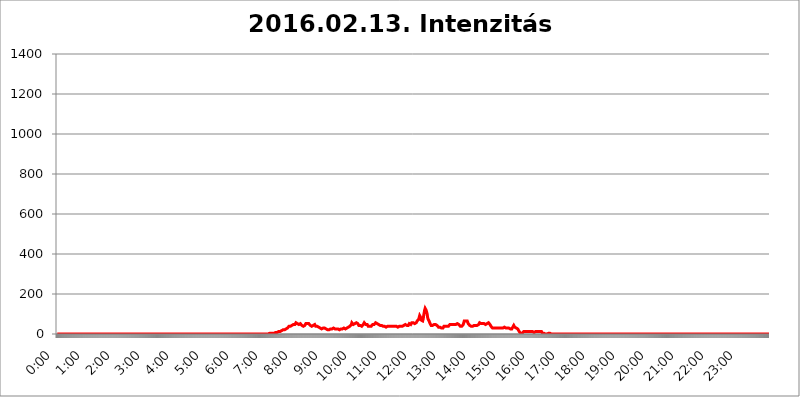
| Category | 2016.02.13. Intenzitás [W/m^2] |
|---|---|
| 0.0 | 0 |
| 0.0006944444444444445 | 0 |
| 0.001388888888888889 | 0 |
| 0.0020833333333333333 | 0 |
| 0.002777777777777778 | 0 |
| 0.003472222222222222 | 0 |
| 0.004166666666666667 | 0 |
| 0.004861111111111111 | 0 |
| 0.005555555555555556 | 0 |
| 0.0062499999999999995 | 0 |
| 0.006944444444444444 | 0 |
| 0.007638888888888889 | 0 |
| 0.008333333333333333 | 0 |
| 0.009027777777777779 | 0 |
| 0.009722222222222222 | 0 |
| 0.010416666666666666 | 0 |
| 0.011111111111111112 | 0 |
| 0.011805555555555555 | 0 |
| 0.012499999999999999 | 0 |
| 0.013194444444444444 | 0 |
| 0.013888888888888888 | 0 |
| 0.014583333333333332 | 0 |
| 0.015277777777777777 | 0 |
| 0.015972222222222224 | 0 |
| 0.016666666666666666 | 0 |
| 0.017361111111111112 | 0 |
| 0.018055555555555557 | 0 |
| 0.01875 | 0 |
| 0.019444444444444445 | 0 |
| 0.02013888888888889 | 0 |
| 0.020833333333333332 | 0 |
| 0.02152777777777778 | 0 |
| 0.022222222222222223 | 0 |
| 0.02291666666666667 | 0 |
| 0.02361111111111111 | 0 |
| 0.024305555555555556 | 0 |
| 0.024999999999999998 | 0 |
| 0.025694444444444447 | 0 |
| 0.02638888888888889 | 0 |
| 0.027083333333333334 | 0 |
| 0.027777777777777776 | 0 |
| 0.02847222222222222 | 0 |
| 0.029166666666666664 | 0 |
| 0.029861111111111113 | 0 |
| 0.030555555555555555 | 0 |
| 0.03125 | 0 |
| 0.03194444444444445 | 0 |
| 0.03263888888888889 | 0 |
| 0.03333333333333333 | 0 |
| 0.034027777777777775 | 0 |
| 0.034722222222222224 | 0 |
| 0.035416666666666666 | 0 |
| 0.036111111111111115 | 0 |
| 0.03680555555555556 | 0 |
| 0.0375 | 0 |
| 0.03819444444444444 | 0 |
| 0.03888888888888889 | 0 |
| 0.03958333333333333 | 0 |
| 0.04027777777777778 | 0 |
| 0.04097222222222222 | 0 |
| 0.041666666666666664 | 0 |
| 0.042361111111111106 | 0 |
| 0.04305555555555556 | 0 |
| 0.043750000000000004 | 0 |
| 0.044444444444444446 | 0 |
| 0.04513888888888889 | 0 |
| 0.04583333333333334 | 0 |
| 0.04652777777777778 | 0 |
| 0.04722222222222222 | 0 |
| 0.04791666666666666 | 0 |
| 0.04861111111111111 | 0 |
| 0.049305555555555554 | 0 |
| 0.049999999999999996 | 0 |
| 0.05069444444444445 | 0 |
| 0.051388888888888894 | 0 |
| 0.052083333333333336 | 0 |
| 0.05277777777777778 | 0 |
| 0.05347222222222222 | 0 |
| 0.05416666666666667 | 0 |
| 0.05486111111111111 | 0 |
| 0.05555555555555555 | 0 |
| 0.05625 | 0 |
| 0.05694444444444444 | 0 |
| 0.057638888888888885 | 0 |
| 0.05833333333333333 | 0 |
| 0.05902777777777778 | 0 |
| 0.059722222222222225 | 0 |
| 0.06041666666666667 | 0 |
| 0.061111111111111116 | 0 |
| 0.06180555555555556 | 0 |
| 0.0625 | 0 |
| 0.06319444444444444 | 0 |
| 0.06388888888888888 | 0 |
| 0.06458333333333334 | 0 |
| 0.06527777777777778 | 0 |
| 0.06597222222222222 | 0 |
| 0.06666666666666667 | 0 |
| 0.06736111111111111 | 0 |
| 0.06805555555555555 | 0 |
| 0.06874999999999999 | 0 |
| 0.06944444444444443 | 0 |
| 0.07013888888888889 | 0 |
| 0.07083333333333333 | 0 |
| 0.07152777777777779 | 0 |
| 0.07222222222222223 | 0 |
| 0.07291666666666667 | 0 |
| 0.07361111111111111 | 0 |
| 0.07430555555555556 | 0 |
| 0.075 | 0 |
| 0.07569444444444444 | 0 |
| 0.0763888888888889 | 0 |
| 0.07708333333333334 | 0 |
| 0.07777777777777778 | 0 |
| 0.07847222222222222 | 0 |
| 0.07916666666666666 | 0 |
| 0.0798611111111111 | 0 |
| 0.08055555555555556 | 0 |
| 0.08125 | 0 |
| 0.08194444444444444 | 0 |
| 0.08263888888888889 | 0 |
| 0.08333333333333333 | 0 |
| 0.08402777777777777 | 0 |
| 0.08472222222222221 | 0 |
| 0.08541666666666665 | 0 |
| 0.08611111111111112 | 0 |
| 0.08680555555555557 | 0 |
| 0.08750000000000001 | 0 |
| 0.08819444444444445 | 0 |
| 0.08888888888888889 | 0 |
| 0.08958333333333333 | 0 |
| 0.09027777777777778 | 0 |
| 0.09097222222222222 | 0 |
| 0.09166666666666667 | 0 |
| 0.09236111111111112 | 0 |
| 0.09305555555555556 | 0 |
| 0.09375 | 0 |
| 0.09444444444444444 | 0 |
| 0.09513888888888888 | 0 |
| 0.09583333333333333 | 0 |
| 0.09652777777777777 | 0 |
| 0.09722222222222222 | 0 |
| 0.09791666666666667 | 0 |
| 0.09861111111111111 | 0 |
| 0.09930555555555555 | 0 |
| 0.09999999999999999 | 0 |
| 0.10069444444444443 | 0 |
| 0.1013888888888889 | 0 |
| 0.10208333333333335 | 0 |
| 0.10277777777777779 | 0 |
| 0.10347222222222223 | 0 |
| 0.10416666666666667 | 0 |
| 0.10486111111111111 | 0 |
| 0.10555555555555556 | 0 |
| 0.10625 | 0 |
| 0.10694444444444444 | 0 |
| 0.1076388888888889 | 0 |
| 0.10833333333333334 | 0 |
| 0.10902777777777778 | 0 |
| 0.10972222222222222 | 0 |
| 0.1111111111111111 | 0 |
| 0.11180555555555556 | 0 |
| 0.11180555555555556 | 0 |
| 0.1125 | 0 |
| 0.11319444444444444 | 0 |
| 0.11388888888888889 | 0 |
| 0.11458333333333333 | 0 |
| 0.11527777777777777 | 0 |
| 0.11597222222222221 | 0 |
| 0.11666666666666665 | 0 |
| 0.1173611111111111 | 0 |
| 0.11805555555555557 | 0 |
| 0.11944444444444445 | 0 |
| 0.12013888888888889 | 0 |
| 0.12083333333333333 | 0 |
| 0.12152777777777778 | 0 |
| 0.12222222222222223 | 0 |
| 0.12291666666666667 | 0 |
| 0.12291666666666667 | 0 |
| 0.12361111111111112 | 0 |
| 0.12430555555555556 | 0 |
| 0.125 | 0 |
| 0.12569444444444444 | 0 |
| 0.12638888888888888 | 0 |
| 0.12708333333333333 | 0 |
| 0.16875 | 0 |
| 0.12847222222222224 | 0 |
| 0.12916666666666668 | 0 |
| 0.12986111111111112 | 0 |
| 0.13055555555555556 | 0 |
| 0.13125 | 0 |
| 0.13194444444444445 | 0 |
| 0.1326388888888889 | 0 |
| 0.13333333333333333 | 0 |
| 0.13402777777777777 | 0 |
| 0.13402777777777777 | 0 |
| 0.13472222222222222 | 0 |
| 0.13541666666666666 | 0 |
| 0.1361111111111111 | 0 |
| 0.13749999999999998 | 0 |
| 0.13819444444444443 | 0 |
| 0.1388888888888889 | 0 |
| 0.13958333333333334 | 0 |
| 0.14027777777777778 | 0 |
| 0.14097222222222222 | 0 |
| 0.14166666666666666 | 0 |
| 0.1423611111111111 | 0 |
| 0.14305555555555557 | 0 |
| 0.14375000000000002 | 0 |
| 0.14444444444444446 | 0 |
| 0.1451388888888889 | 0 |
| 0.1451388888888889 | 0 |
| 0.14652777777777778 | 0 |
| 0.14722222222222223 | 0 |
| 0.14791666666666667 | 0 |
| 0.1486111111111111 | 0 |
| 0.14930555555555555 | 0 |
| 0.15 | 0 |
| 0.15069444444444444 | 0 |
| 0.15138888888888888 | 0 |
| 0.15208333333333332 | 0 |
| 0.15277777777777776 | 0 |
| 0.15347222222222223 | 0 |
| 0.15416666666666667 | 0 |
| 0.15486111111111112 | 0 |
| 0.15555555555555556 | 0 |
| 0.15625 | 0 |
| 0.15694444444444444 | 0 |
| 0.15763888888888888 | 0 |
| 0.15833333333333333 | 0 |
| 0.15902777777777777 | 0 |
| 0.15972222222222224 | 0 |
| 0.16041666666666668 | 0 |
| 0.16111111111111112 | 0 |
| 0.16180555555555556 | 0 |
| 0.1625 | 0 |
| 0.16319444444444445 | 0 |
| 0.1638888888888889 | 0 |
| 0.16458333333333333 | 0 |
| 0.16527777777777777 | 0 |
| 0.16597222222222222 | 0 |
| 0.16666666666666666 | 0 |
| 0.1673611111111111 | 0 |
| 0.16805555555555554 | 0 |
| 0.16874999999999998 | 0 |
| 0.16944444444444443 | 0 |
| 0.17013888888888887 | 0 |
| 0.1708333333333333 | 0 |
| 0.17152777777777775 | 0 |
| 0.17222222222222225 | 0 |
| 0.1729166666666667 | 0 |
| 0.17361111111111113 | 0 |
| 0.17430555555555557 | 0 |
| 0.17500000000000002 | 0 |
| 0.17569444444444446 | 0 |
| 0.1763888888888889 | 0 |
| 0.17708333333333334 | 0 |
| 0.17777777777777778 | 0 |
| 0.17847222222222223 | 0 |
| 0.17916666666666667 | 0 |
| 0.1798611111111111 | 0 |
| 0.18055555555555555 | 0 |
| 0.18125 | 0 |
| 0.18194444444444444 | 0 |
| 0.1826388888888889 | 0 |
| 0.18333333333333335 | 0 |
| 0.1840277777777778 | 0 |
| 0.18472222222222223 | 0 |
| 0.18541666666666667 | 0 |
| 0.18611111111111112 | 0 |
| 0.18680555555555556 | 0 |
| 0.1875 | 0 |
| 0.18819444444444444 | 0 |
| 0.18888888888888888 | 0 |
| 0.18958333333333333 | 0 |
| 0.19027777777777777 | 0 |
| 0.1909722222222222 | 0 |
| 0.19166666666666665 | 0 |
| 0.19236111111111112 | 0 |
| 0.19305555555555554 | 0 |
| 0.19375 | 0 |
| 0.19444444444444445 | 0 |
| 0.1951388888888889 | 0 |
| 0.19583333333333333 | 0 |
| 0.19652777777777777 | 0 |
| 0.19722222222222222 | 0 |
| 0.19791666666666666 | 0 |
| 0.1986111111111111 | 0 |
| 0.19930555555555554 | 0 |
| 0.19999999999999998 | 0 |
| 0.20069444444444443 | 0 |
| 0.20138888888888887 | 0 |
| 0.2020833333333333 | 0 |
| 0.2027777777777778 | 0 |
| 0.2034722222222222 | 0 |
| 0.2041666666666667 | 0 |
| 0.20486111111111113 | 0 |
| 0.20555555555555557 | 0 |
| 0.20625000000000002 | 0 |
| 0.20694444444444446 | 0 |
| 0.2076388888888889 | 0 |
| 0.20833333333333334 | 0 |
| 0.20902777777777778 | 0 |
| 0.20972222222222223 | 0 |
| 0.21041666666666667 | 0 |
| 0.2111111111111111 | 0 |
| 0.21180555555555555 | 0 |
| 0.2125 | 0 |
| 0.21319444444444444 | 0 |
| 0.2138888888888889 | 0 |
| 0.21458333333333335 | 0 |
| 0.2152777777777778 | 0 |
| 0.21597222222222223 | 0 |
| 0.21666666666666667 | 0 |
| 0.21736111111111112 | 0 |
| 0.21805555555555556 | 0 |
| 0.21875 | 0 |
| 0.21944444444444444 | 0 |
| 0.22013888888888888 | 0 |
| 0.22083333333333333 | 0 |
| 0.22152777777777777 | 0 |
| 0.2222222222222222 | 0 |
| 0.22291666666666665 | 0 |
| 0.2236111111111111 | 0 |
| 0.22430555555555556 | 0 |
| 0.225 | 0 |
| 0.22569444444444445 | 0 |
| 0.2263888888888889 | 0 |
| 0.22708333333333333 | 0 |
| 0.22777777777777777 | 0 |
| 0.22847222222222222 | 0 |
| 0.22916666666666666 | 0 |
| 0.2298611111111111 | 0 |
| 0.23055555555555554 | 0 |
| 0.23124999999999998 | 0 |
| 0.23194444444444443 | 0 |
| 0.23263888888888887 | 0 |
| 0.2333333333333333 | 0 |
| 0.2340277777777778 | 0 |
| 0.2347222222222222 | 0 |
| 0.2354166666666667 | 0 |
| 0.23611111111111113 | 0 |
| 0.23680555555555557 | 0 |
| 0.23750000000000002 | 0 |
| 0.23819444444444446 | 0 |
| 0.2388888888888889 | 0 |
| 0.23958333333333334 | 0 |
| 0.24027777777777778 | 0 |
| 0.24097222222222223 | 0 |
| 0.24166666666666667 | 0 |
| 0.2423611111111111 | 0 |
| 0.24305555555555555 | 0 |
| 0.24375 | 0 |
| 0.24444444444444446 | 0 |
| 0.24513888888888888 | 0 |
| 0.24583333333333335 | 0 |
| 0.2465277777777778 | 0 |
| 0.24722222222222223 | 0 |
| 0.24791666666666667 | 0 |
| 0.24861111111111112 | 0 |
| 0.24930555555555556 | 0 |
| 0.25 | 0 |
| 0.25069444444444444 | 0 |
| 0.2513888888888889 | 0 |
| 0.2520833333333333 | 0 |
| 0.25277777777777777 | 0 |
| 0.2534722222222222 | 0 |
| 0.25416666666666665 | 0 |
| 0.2548611111111111 | 0 |
| 0.2555555555555556 | 0 |
| 0.25625000000000003 | 0 |
| 0.2569444444444445 | 0 |
| 0.2576388888888889 | 0 |
| 0.25833333333333336 | 0 |
| 0.2590277777777778 | 0 |
| 0.25972222222222224 | 0 |
| 0.2604166666666667 | 0 |
| 0.2611111111111111 | 0 |
| 0.26180555555555557 | 0 |
| 0.2625 | 0 |
| 0.26319444444444445 | 0 |
| 0.2638888888888889 | 0 |
| 0.26458333333333334 | 0 |
| 0.2652777777777778 | 0 |
| 0.2659722222222222 | 0 |
| 0.26666666666666666 | 0 |
| 0.2673611111111111 | 0 |
| 0.26805555555555555 | 0 |
| 0.26875 | 0 |
| 0.26944444444444443 | 0 |
| 0.2701388888888889 | 0 |
| 0.2708333333333333 | 0 |
| 0.27152777777777776 | 0 |
| 0.2722222222222222 | 0 |
| 0.27291666666666664 | 0 |
| 0.2736111111111111 | 0 |
| 0.2743055555555555 | 0 |
| 0.27499999999999997 | 0 |
| 0.27569444444444446 | 0 |
| 0.27638888888888885 | 0 |
| 0.27708333333333335 | 0 |
| 0.2777777777777778 | 0 |
| 0.27847222222222223 | 0 |
| 0.2791666666666667 | 0 |
| 0.2798611111111111 | 0 |
| 0.28055555555555556 | 0 |
| 0.28125 | 0 |
| 0.28194444444444444 | 0 |
| 0.2826388888888889 | 0 |
| 0.2833333333333333 | 0 |
| 0.28402777777777777 | 0 |
| 0.2847222222222222 | 0 |
| 0.28541666666666665 | 0 |
| 0.28611111111111115 | 0 |
| 0.28680555555555554 | 0 |
| 0.28750000000000003 | 0 |
| 0.2881944444444445 | 0 |
| 0.2888888888888889 | 0 |
| 0.28958333333333336 | 0 |
| 0.2902777777777778 | 0 |
| 0.29097222222222224 | 0 |
| 0.2916666666666667 | 0 |
| 0.2923611111111111 | 0 |
| 0.29305555555555557 | 0 |
| 0.29375 | 0 |
| 0.29444444444444445 | 0 |
| 0.2951388888888889 | 0 |
| 0.29583333333333334 | 0 |
| 0.2965277777777778 | 0 |
| 0.2972222222222222 | 3.525 |
| 0.29791666666666666 | 3.525 |
| 0.2986111111111111 | 3.525 |
| 0.29930555555555555 | 3.525 |
| 0.3 | 3.525 |
| 0.30069444444444443 | 3.525 |
| 0.3013888888888889 | 3.525 |
| 0.3020833333333333 | 3.525 |
| 0.30277777777777776 | 3.525 |
| 0.3034722222222222 | 7.887 |
| 0.30416666666666664 | 3.525 |
| 0.3048611111111111 | 3.525 |
| 0.3055555555555555 | 7.887 |
| 0.30624999999999997 | 7.887 |
| 0.3069444444444444 | 7.887 |
| 0.3076388888888889 | 7.887 |
| 0.30833333333333335 | 7.887 |
| 0.3090277777777778 | 7.887 |
| 0.30972222222222223 | 12.257 |
| 0.3104166666666667 | 12.257 |
| 0.3111111111111111 | 12.257 |
| 0.31180555555555556 | 12.257 |
| 0.3125 | 12.257 |
| 0.31319444444444444 | 12.257 |
| 0.3138888888888889 | 16.636 |
| 0.3145833333333333 | 16.636 |
| 0.31527777777777777 | 21.024 |
| 0.3159722222222222 | 21.024 |
| 0.31666666666666665 | 21.024 |
| 0.31736111111111115 | 21.024 |
| 0.31805555555555554 | 21.024 |
| 0.31875000000000003 | 21.024 |
| 0.3194444444444445 | 21.024 |
| 0.3201388888888889 | 25.419 |
| 0.32083333333333336 | 25.419 |
| 0.3215277777777778 | 29.823 |
| 0.32222222222222224 | 29.823 |
| 0.3229166666666667 | 29.823 |
| 0.3236111111111111 | 29.823 |
| 0.32430555555555557 | 34.234 |
| 0.325 | 38.653 |
| 0.32569444444444445 | 38.653 |
| 0.3263888888888889 | 38.653 |
| 0.32708333333333334 | 38.653 |
| 0.3277777777777778 | 38.653 |
| 0.3284722222222222 | 43.079 |
| 0.32916666666666666 | 43.079 |
| 0.3298611111111111 | 47.511 |
| 0.33055555555555555 | 47.511 |
| 0.33125 | 47.511 |
| 0.33194444444444443 | 47.511 |
| 0.3326388888888889 | 47.511 |
| 0.3333333333333333 | 47.511 |
| 0.3340277777777778 | 47.511 |
| 0.3347222222222222 | 56.398 |
| 0.3354166666666667 | 56.398 |
| 0.3361111111111111 | 56.398 |
| 0.3368055555555556 | 51.951 |
| 0.33749999999999997 | 51.951 |
| 0.33819444444444446 | 47.511 |
| 0.33888888888888885 | 47.511 |
| 0.33958333333333335 | 51.951 |
| 0.34027777777777773 | 51.951 |
| 0.34097222222222223 | 51.951 |
| 0.3416666666666666 | 51.951 |
| 0.3423611111111111 | 47.511 |
| 0.3430555555555555 | 43.079 |
| 0.34375 | 38.653 |
| 0.3444444444444445 | 38.653 |
| 0.3451388888888889 | 38.653 |
| 0.3458333333333334 | 34.234 |
| 0.34652777777777777 | 38.653 |
| 0.34722222222222227 | 43.079 |
| 0.34791666666666665 | 47.511 |
| 0.34861111111111115 | 51.951 |
| 0.34930555555555554 | 56.398 |
| 0.35000000000000003 | 51.951 |
| 0.3506944444444444 | 51.951 |
| 0.3513888888888889 | 51.951 |
| 0.3520833333333333 | 51.951 |
| 0.3527777777777778 | 51.951 |
| 0.3534722222222222 | 47.511 |
| 0.3541666666666667 | 47.511 |
| 0.3548611111111111 | 43.079 |
| 0.35555555555555557 | 43.079 |
| 0.35625 | 43.079 |
| 0.35694444444444445 | 38.653 |
| 0.3576388888888889 | 43.079 |
| 0.35833333333333334 | 43.079 |
| 0.3590277777777778 | 43.079 |
| 0.3597222222222222 | 47.511 |
| 0.36041666666666666 | 47.511 |
| 0.3611111111111111 | 47.511 |
| 0.36180555555555555 | 43.079 |
| 0.3625 | 38.653 |
| 0.36319444444444443 | 38.653 |
| 0.3638888888888889 | 43.079 |
| 0.3645833333333333 | 38.653 |
| 0.3652777777777778 | 38.653 |
| 0.3659722222222222 | 34.234 |
| 0.3666666666666667 | 34.234 |
| 0.3673611111111111 | 29.823 |
| 0.3680555555555556 | 29.823 |
| 0.36874999999999997 | 29.823 |
| 0.36944444444444446 | 25.419 |
| 0.37013888888888885 | 25.419 |
| 0.37083333333333335 | 25.419 |
| 0.37152777777777773 | 25.419 |
| 0.37222222222222223 | 25.419 |
| 0.3729166666666666 | 29.823 |
| 0.3736111111111111 | 29.823 |
| 0.3743055555555555 | 29.823 |
| 0.375 | 29.823 |
| 0.3756944444444445 | 25.419 |
| 0.3763888888888889 | 25.419 |
| 0.3770833333333334 | 25.419 |
| 0.37777777777777777 | 21.024 |
| 0.37847222222222227 | 21.024 |
| 0.37916666666666665 | 21.024 |
| 0.37986111111111115 | 21.024 |
| 0.38055555555555554 | 21.024 |
| 0.38125000000000003 | 21.024 |
| 0.3819444444444444 | 21.024 |
| 0.3826388888888889 | 25.419 |
| 0.3833333333333333 | 25.419 |
| 0.3840277777777778 | 25.419 |
| 0.3847222222222222 | 25.419 |
| 0.3854166666666667 | 25.419 |
| 0.3861111111111111 | 25.419 |
| 0.38680555555555557 | 25.419 |
| 0.3875 | 29.823 |
| 0.38819444444444445 | 29.823 |
| 0.3888888888888889 | 25.419 |
| 0.38958333333333334 | 25.419 |
| 0.3902777777777778 | 25.419 |
| 0.3909722222222222 | 25.419 |
| 0.39166666666666666 | 25.419 |
| 0.3923611111111111 | 25.419 |
| 0.39305555555555555 | 25.419 |
| 0.39375 | 25.419 |
| 0.39444444444444443 | 25.419 |
| 0.3951388888888889 | 25.419 |
| 0.3958333333333333 | 21.024 |
| 0.3965277777777778 | 25.419 |
| 0.3972222222222222 | 25.419 |
| 0.3979166666666667 | 25.419 |
| 0.3986111111111111 | 25.419 |
| 0.3993055555555556 | 25.419 |
| 0.39999999999999997 | 25.419 |
| 0.40069444444444446 | 25.419 |
| 0.40138888888888885 | 29.823 |
| 0.40208333333333335 | 29.823 |
| 0.40277777777777773 | 25.419 |
| 0.40347222222222223 | 25.419 |
| 0.4041666666666666 | 25.419 |
| 0.4048611111111111 | 25.419 |
| 0.4055555555555555 | 25.419 |
| 0.40625 | 29.823 |
| 0.4069444444444445 | 34.234 |
| 0.4076388888888889 | 29.823 |
| 0.4083333333333334 | 34.234 |
| 0.40902777777777777 | 38.653 |
| 0.40972222222222227 | 38.653 |
| 0.41041666666666665 | 38.653 |
| 0.41111111111111115 | 38.653 |
| 0.41180555555555554 | 43.079 |
| 0.41250000000000003 | 47.511 |
| 0.4131944444444444 | 56.398 |
| 0.4138888888888889 | 60.85 |
| 0.4145833333333333 | 56.398 |
| 0.4152777777777778 | 47.511 |
| 0.4159722222222222 | 47.511 |
| 0.4166666666666667 | 47.511 |
| 0.4173611111111111 | 51.951 |
| 0.41805555555555557 | 51.951 |
| 0.41875 | 51.951 |
| 0.41944444444444445 | 56.398 |
| 0.4201388888888889 | 60.85 |
| 0.42083333333333334 | 56.398 |
| 0.4215277777777778 | 51.951 |
| 0.4222222222222222 | 51.951 |
| 0.42291666666666666 | 43.079 |
| 0.4236111111111111 | 43.079 |
| 0.42430555555555555 | 43.079 |
| 0.425 | 43.079 |
| 0.42569444444444443 | 38.653 |
| 0.4263888888888889 | 38.653 |
| 0.4270833333333333 | 38.653 |
| 0.4277777777777778 | 43.079 |
| 0.4284722222222222 | 43.079 |
| 0.4291666666666667 | 47.511 |
| 0.4298611111111111 | 51.951 |
| 0.4305555555555556 | 56.398 |
| 0.43124999999999997 | 60.85 |
| 0.43194444444444446 | 56.398 |
| 0.43263888888888885 | 47.511 |
| 0.43333333333333335 | 47.511 |
| 0.43402777777777773 | 43.079 |
| 0.43472222222222223 | 47.511 |
| 0.4354166666666666 | 43.079 |
| 0.4361111111111111 | 38.653 |
| 0.4368055555555555 | 38.653 |
| 0.4375 | 38.653 |
| 0.4381944444444445 | 38.653 |
| 0.4388888888888889 | 38.653 |
| 0.4395833333333334 | 38.653 |
| 0.44027777777777777 | 38.653 |
| 0.44097222222222227 | 43.079 |
| 0.44166666666666665 | 43.079 |
| 0.44236111111111115 | 47.511 |
| 0.44305555555555554 | 47.511 |
| 0.44375000000000003 | 47.511 |
| 0.4444444444444444 | 47.511 |
| 0.4451388888888889 | 47.511 |
| 0.4458333333333333 | 47.511 |
| 0.4465277777777778 | 56.398 |
| 0.4472222222222222 | 56.398 |
| 0.4479166666666667 | 56.398 |
| 0.4486111111111111 | 51.951 |
| 0.44930555555555557 | 51.951 |
| 0.45 | 47.511 |
| 0.45069444444444445 | 47.511 |
| 0.4513888888888889 | 47.511 |
| 0.45208333333333334 | 47.511 |
| 0.4527777777777778 | 43.079 |
| 0.4534722222222222 | 43.079 |
| 0.45416666666666666 | 43.079 |
| 0.4548611111111111 | 43.079 |
| 0.45555555555555555 | 43.079 |
| 0.45625 | 38.653 |
| 0.45694444444444443 | 38.653 |
| 0.4576388888888889 | 38.653 |
| 0.4583333333333333 | 38.653 |
| 0.4590277777777778 | 38.653 |
| 0.4597222222222222 | 34.234 |
| 0.4604166666666667 | 38.653 |
| 0.4611111111111111 | 34.234 |
| 0.4618055555555556 | 34.234 |
| 0.46249999999999997 | 38.653 |
| 0.46319444444444446 | 38.653 |
| 0.46388888888888885 | 38.653 |
| 0.46458333333333335 | 43.079 |
| 0.46527777777777773 | 38.653 |
| 0.46597222222222223 | 38.653 |
| 0.4666666666666666 | 38.653 |
| 0.4673611111111111 | 38.653 |
| 0.4680555555555555 | 38.653 |
| 0.46875 | 38.653 |
| 0.4694444444444445 | 38.653 |
| 0.4701388888888889 | 34.234 |
| 0.4708333333333334 | 34.234 |
| 0.47152777777777777 | 38.653 |
| 0.47222222222222227 | 38.653 |
| 0.47291666666666665 | 38.653 |
| 0.47361111111111115 | 38.653 |
| 0.47430555555555554 | 34.234 |
| 0.47500000000000003 | 38.653 |
| 0.4756944444444444 | 38.653 |
| 0.4763888888888889 | 34.234 |
| 0.4770833333333333 | 34.234 |
| 0.4777777777777778 | 34.234 |
| 0.4784722222222222 | 38.653 |
| 0.4791666666666667 | 38.653 |
| 0.4798611111111111 | 38.653 |
| 0.48055555555555557 | 38.653 |
| 0.48125 | 38.653 |
| 0.48194444444444445 | 38.653 |
| 0.4826388888888889 | 38.653 |
| 0.48333333333333334 | 34.234 |
| 0.4840277777777778 | 38.653 |
| 0.4847222222222222 | 38.653 |
| 0.48541666666666666 | 38.653 |
| 0.4861111111111111 | 43.079 |
| 0.48680555555555555 | 43.079 |
| 0.4875 | 47.511 |
| 0.48819444444444443 | 47.511 |
| 0.4888888888888889 | 47.511 |
| 0.4895833333333333 | 43.079 |
| 0.4902777777777778 | 43.079 |
| 0.4909722222222222 | 47.511 |
| 0.4916666666666667 | 43.079 |
| 0.4923611111111111 | 43.079 |
| 0.4930555555555556 | 47.511 |
| 0.49374999999999997 | 51.951 |
| 0.49444444444444446 | 51.951 |
| 0.49513888888888885 | 47.511 |
| 0.49583333333333335 | 47.511 |
| 0.49652777777777773 | 47.511 |
| 0.49722222222222223 | 56.398 |
| 0.4979166666666666 | 56.398 |
| 0.4986111111111111 | 56.398 |
| 0.4993055555555555 | 56.398 |
| 0.5 | 56.398 |
| 0.5006944444444444 | 56.398 |
| 0.5013888888888889 | 51.951 |
| 0.5020833333333333 | 47.511 |
| 0.5027777777777778 | 56.398 |
| 0.5034722222222222 | 56.398 |
| 0.5041666666666667 | 56.398 |
| 0.5048611111111111 | 65.31 |
| 0.5055555555555555 | 69.775 |
| 0.50625 | 69.775 |
| 0.5069444444444444 | 74.246 |
| 0.5076388888888889 | 83.205 |
| 0.5083333333333333 | 92.184 |
| 0.5090277777777777 | 96.682 |
| 0.5097222222222222 | 83.205 |
| 0.5104166666666666 | 69.775 |
| 0.5111111111111112 | 65.31 |
| 0.5118055555555555 | 65.31 |
| 0.5125000000000001 | 65.31 |
| 0.5131944444444444 | 74.246 |
| 0.513888888888889 | 92.184 |
| 0.5145833333333333 | 105.69 |
| 0.5152777777777778 | 119.235 |
| 0.5159722222222222 | 128.284 |
| 0.5166666666666667 | 132.814 |
| 0.517361111111111 | 119.235 |
| 0.5180555555555556 | 110.201 |
| 0.5187499999999999 | 101.184 |
| 0.5194444444444445 | 83.205 |
| 0.5201388888888888 | 74.246 |
| 0.5208333333333334 | 69.775 |
| 0.5215277777777778 | 65.31 |
| 0.5222222222222223 | 60.85 |
| 0.5229166666666667 | 51.951 |
| 0.5236111111111111 | 47.511 |
| 0.5243055555555556 | 43.079 |
| 0.525 | 43.079 |
| 0.5256944444444445 | 43.079 |
| 0.5263888888888889 | 43.079 |
| 0.5270833333333333 | 47.511 |
| 0.5277777777777778 | 47.511 |
| 0.5284722222222222 | 47.511 |
| 0.5291666666666667 | 47.511 |
| 0.5298611111111111 | 47.511 |
| 0.5305555555555556 | 47.511 |
| 0.53125 | 47.511 |
| 0.5319444444444444 | 43.079 |
| 0.5326388888888889 | 43.079 |
| 0.5333333333333333 | 38.653 |
| 0.5340277777777778 | 38.653 |
| 0.5347222222222222 | 34.234 |
| 0.5354166666666667 | 34.234 |
| 0.5361111111111111 | 34.234 |
| 0.5368055555555555 | 34.234 |
| 0.5375 | 34.234 |
| 0.5381944444444444 | 29.823 |
| 0.5388888888888889 | 29.823 |
| 0.5395833333333333 | 29.823 |
| 0.5402777777777777 | 29.823 |
| 0.5409722222222222 | 29.823 |
| 0.5416666666666666 | 34.234 |
| 0.5423611111111112 | 38.653 |
| 0.5430555555555555 | 38.653 |
| 0.5437500000000001 | 38.653 |
| 0.5444444444444444 | 38.653 |
| 0.545138888888889 | 38.653 |
| 0.5458333333333333 | 38.653 |
| 0.5465277777777778 | 38.653 |
| 0.5472222222222222 | 38.653 |
| 0.5479166666666667 | 38.653 |
| 0.548611111111111 | 38.653 |
| 0.5493055555555556 | 43.079 |
| 0.5499999999999999 | 43.079 |
| 0.5506944444444445 | 47.511 |
| 0.5513888888888888 | 51.951 |
| 0.5520833333333334 | 51.951 |
| 0.5527777777777778 | 47.511 |
| 0.5534722222222223 | 51.951 |
| 0.5541666666666667 | 51.951 |
| 0.5548611111111111 | 47.511 |
| 0.5555555555555556 | 47.511 |
| 0.55625 | 47.511 |
| 0.5569444444444445 | 47.511 |
| 0.5576388888888889 | 47.511 |
| 0.5583333333333333 | 47.511 |
| 0.5590277777777778 | 47.511 |
| 0.5597222222222222 | 47.511 |
| 0.5604166666666667 | 51.951 |
| 0.5611111111111111 | 51.951 |
| 0.5618055555555556 | 47.511 |
| 0.5625 | 47.511 |
| 0.5631944444444444 | 47.511 |
| 0.5638888888888889 | 47.511 |
| 0.5645833333333333 | 43.079 |
| 0.5652777777777778 | 38.653 |
| 0.5659722222222222 | 38.653 |
| 0.5666666666666667 | 38.653 |
| 0.5673611111111111 | 38.653 |
| 0.5680555555555555 | 38.653 |
| 0.56875 | 43.079 |
| 0.5694444444444444 | 47.511 |
| 0.5701388888888889 | 56.398 |
| 0.5708333333333333 | 65.31 |
| 0.5715277777777777 | 65.31 |
| 0.5722222222222222 | 65.31 |
| 0.5729166666666666 | 65.31 |
| 0.5736111111111112 | 65.31 |
| 0.5743055555555555 | 65.31 |
| 0.5750000000000001 | 65.31 |
| 0.5756944444444444 | 60.85 |
| 0.576388888888889 | 51.951 |
| 0.5770833333333333 | 47.511 |
| 0.5777777777777778 | 47.511 |
| 0.5784722222222222 | 43.079 |
| 0.5791666666666667 | 43.079 |
| 0.579861111111111 | 38.653 |
| 0.5805555555555556 | 38.653 |
| 0.5812499999999999 | 38.653 |
| 0.5819444444444445 | 38.653 |
| 0.5826388888888888 | 38.653 |
| 0.5833333333333334 | 43.079 |
| 0.5840277777777778 | 43.079 |
| 0.5847222222222223 | 43.079 |
| 0.5854166666666667 | 38.653 |
| 0.5861111111111111 | 38.653 |
| 0.5868055555555556 | 43.079 |
| 0.5875 | 43.079 |
| 0.5881944444444445 | 43.079 |
| 0.5888888888888889 | 43.079 |
| 0.5895833333333333 | 47.511 |
| 0.5902777777777778 | 47.511 |
| 0.5909722222222222 | 47.511 |
| 0.5916666666666667 | 51.951 |
| 0.5923611111111111 | 56.398 |
| 0.5930555555555556 | 56.398 |
| 0.59375 | 51.951 |
| 0.5944444444444444 | 51.951 |
| 0.5951388888888889 | 51.951 |
| 0.5958333333333333 | 51.951 |
| 0.5965277777777778 | 51.951 |
| 0.5972222222222222 | 51.951 |
| 0.5979166666666667 | 51.951 |
| 0.5986111111111111 | 51.951 |
| 0.5993055555555555 | 51.951 |
| 0.6 | 47.511 |
| 0.6006944444444444 | 47.511 |
| 0.6013888888888889 | 47.511 |
| 0.6020833333333333 | 51.951 |
| 0.6027777777777777 | 51.951 |
| 0.6034722222222222 | 56.398 |
| 0.6041666666666666 | 56.398 |
| 0.6048611111111112 | 56.398 |
| 0.6055555555555555 | 51.951 |
| 0.6062500000000001 | 51.951 |
| 0.6069444444444444 | 47.511 |
| 0.607638888888889 | 43.079 |
| 0.6083333333333333 | 38.653 |
| 0.6090277777777778 | 38.653 |
| 0.6097222222222222 | 34.234 |
| 0.6104166666666667 | 29.823 |
| 0.611111111111111 | 29.823 |
| 0.6118055555555556 | 25.419 |
| 0.6124999999999999 | 29.823 |
| 0.6131944444444445 | 29.823 |
| 0.6138888888888888 | 29.823 |
| 0.6145833333333334 | 29.823 |
| 0.6152777777777778 | 29.823 |
| 0.6159722222222223 | 29.823 |
| 0.6166666666666667 | 29.823 |
| 0.6173611111111111 | 29.823 |
| 0.6180555555555556 | 29.823 |
| 0.61875 | 29.823 |
| 0.6194444444444445 | 29.823 |
| 0.6201388888888889 | 29.823 |
| 0.6208333333333333 | 29.823 |
| 0.6215277777777778 | 29.823 |
| 0.6222222222222222 | 29.823 |
| 0.6229166666666667 | 29.823 |
| 0.6236111111111111 | 29.823 |
| 0.6243055555555556 | 29.823 |
| 0.625 | 29.823 |
| 0.6256944444444444 | 29.823 |
| 0.6263888888888889 | 34.234 |
| 0.6270833333333333 | 34.234 |
| 0.6277777777777778 | 34.234 |
| 0.6284722222222222 | 29.823 |
| 0.6291666666666667 | 29.823 |
| 0.6298611111111111 | 29.823 |
| 0.6305555555555555 | 29.823 |
| 0.63125 | 29.823 |
| 0.6319444444444444 | 25.419 |
| 0.6326388888888889 | 29.823 |
| 0.6333333333333333 | 29.823 |
| 0.6340277777777777 | 25.419 |
| 0.6347222222222222 | 25.419 |
| 0.6354166666666666 | 25.419 |
| 0.6361111111111112 | 25.419 |
| 0.6368055555555555 | 25.419 |
| 0.6375000000000001 | 25.419 |
| 0.6381944444444444 | 29.823 |
| 0.638888888888889 | 34.234 |
| 0.6395833333333333 | 38.653 |
| 0.6402777777777778 | 43.079 |
| 0.6409722222222222 | 38.653 |
| 0.6416666666666667 | 34.234 |
| 0.642361111111111 | 34.234 |
| 0.6430555555555556 | 29.823 |
| 0.6437499999999999 | 29.823 |
| 0.6444444444444445 | 25.419 |
| 0.6451388888888888 | 25.419 |
| 0.6458333333333334 | 25.419 |
| 0.6465277777777778 | 21.024 |
| 0.6472222222222223 | 21.024 |
| 0.6479166666666667 | 12.257 |
| 0.6486111111111111 | 7.887 |
| 0.6493055555555556 | 7.887 |
| 0.65 | 3.525 |
| 0.6506944444444445 | 3.525 |
| 0.6513888888888889 | 3.525 |
| 0.6520833333333333 | 3.525 |
| 0.6527777777777778 | 3.525 |
| 0.6534722222222222 | 7.887 |
| 0.6541666666666667 | 12.257 |
| 0.6548611111111111 | 12.257 |
| 0.6555555555555556 | 12.257 |
| 0.65625 | 12.257 |
| 0.6569444444444444 | 12.257 |
| 0.6576388888888889 | 12.257 |
| 0.6583333333333333 | 12.257 |
| 0.6590277777777778 | 12.257 |
| 0.6597222222222222 | 12.257 |
| 0.6604166666666667 | 12.257 |
| 0.6611111111111111 | 7.887 |
| 0.6618055555555555 | 12.257 |
| 0.6625 | 12.257 |
| 0.6631944444444444 | 16.636 |
| 0.6638888888888889 | 12.257 |
| 0.6645833333333333 | 12.257 |
| 0.6652777777777777 | 12.257 |
| 0.6659722222222222 | 12.257 |
| 0.6666666666666666 | 12.257 |
| 0.6673611111111111 | 12.257 |
| 0.6680555555555556 | 12.257 |
| 0.6687500000000001 | 7.887 |
| 0.6694444444444444 | 7.887 |
| 0.6701388888888888 | 12.257 |
| 0.6708333333333334 | 12.257 |
| 0.6715277777777778 | 12.257 |
| 0.6722222222222222 | 12.257 |
| 0.6729166666666666 | 12.257 |
| 0.6736111111111112 | 12.257 |
| 0.6743055555555556 | 12.257 |
| 0.6749999999999999 | 12.257 |
| 0.6756944444444444 | 12.257 |
| 0.6763888888888889 | 12.257 |
| 0.6770833333333334 | 12.257 |
| 0.6777777777777777 | 12.257 |
| 0.6784722222222223 | 12.257 |
| 0.6791666666666667 | 12.257 |
| 0.6798611111111111 | 7.887 |
| 0.6805555555555555 | 3.525 |
| 0.68125 | 3.525 |
| 0.6819444444444445 | 0 |
| 0.6826388888888889 | 3.525 |
| 0.6833333333333332 | 0 |
| 0.6840277777777778 | 0 |
| 0.6847222222222222 | 0 |
| 0.6854166666666667 | 0 |
| 0.686111111111111 | 0 |
| 0.6868055555555556 | 0 |
| 0.6875 | 0 |
| 0.6881944444444444 | 3.525 |
| 0.688888888888889 | 3.525 |
| 0.6895833333333333 | 3.525 |
| 0.6902777777777778 | 3.525 |
| 0.6909722222222222 | 3.525 |
| 0.6916666666666668 | 3.525 |
| 0.6923611111111111 | 3.525 |
| 0.6930555555555555 | 0 |
| 0.69375 | 0 |
| 0.6944444444444445 | 0 |
| 0.6951388888888889 | 0 |
| 0.6958333333333333 | 0 |
| 0.6965277777777777 | 0 |
| 0.6972222222222223 | 0 |
| 0.6979166666666666 | 0 |
| 0.6986111111111111 | 0 |
| 0.6993055555555556 | 0 |
| 0.7000000000000001 | 0 |
| 0.7006944444444444 | 0 |
| 0.7013888888888888 | 0 |
| 0.7020833333333334 | 0 |
| 0.7027777777777778 | 0 |
| 0.7034722222222222 | 0 |
| 0.7041666666666666 | 0 |
| 0.7048611111111112 | 0 |
| 0.7055555555555556 | 0 |
| 0.7062499999999999 | 0 |
| 0.7069444444444444 | 0 |
| 0.7076388888888889 | 0 |
| 0.7083333333333334 | 0 |
| 0.7090277777777777 | 0 |
| 0.7097222222222223 | 0 |
| 0.7104166666666667 | 0 |
| 0.7111111111111111 | 0 |
| 0.7118055555555555 | 0 |
| 0.7125 | 0 |
| 0.7131944444444445 | 0 |
| 0.7138888888888889 | 0 |
| 0.7145833333333332 | 0 |
| 0.7152777777777778 | 0 |
| 0.7159722222222222 | 0 |
| 0.7166666666666667 | 0 |
| 0.717361111111111 | 0 |
| 0.7180555555555556 | 0 |
| 0.71875 | 0 |
| 0.7194444444444444 | 0 |
| 0.720138888888889 | 0 |
| 0.7208333333333333 | 0 |
| 0.7215277777777778 | 0 |
| 0.7222222222222222 | 0 |
| 0.7229166666666668 | 0 |
| 0.7236111111111111 | 0 |
| 0.7243055555555555 | 0 |
| 0.725 | 0 |
| 0.7256944444444445 | 0 |
| 0.7263888888888889 | 0 |
| 0.7270833333333333 | 0 |
| 0.7277777777777777 | 0 |
| 0.7284722222222223 | 0 |
| 0.7291666666666666 | 0 |
| 0.7298611111111111 | 0 |
| 0.7305555555555556 | 0 |
| 0.7312500000000001 | 0 |
| 0.7319444444444444 | 0 |
| 0.7326388888888888 | 0 |
| 0.7333333333333334 | 0 |
| 0.7340277777777778 | 0 |
| 0.7347222222222222 | 0 |
| 0.7354166666666666 | 0 |
| 0.7361111111111112 | 0 |
| 0.7368055555555556 | 0 |
| 0.7374999999999999 | 0 |
| 0.7381944444444444 | 0 |
| 0.7388888888888889 | 0 |
| 0.7395833333333334 | 0 |
| 0.7402777777777777 | 0 |
| 0.7409722222222223 | 0 |
| 0.7416666666666667 | 0 |
| 0.7423611111111111 | 0 |
| 0.7430555555555555 | 0 |
| 0.74375 | 0 |
| 0.7444444444444445 | 0 |
| 0.7451388888888889 | 0 |
| 0.7458333333333332 | 0 |
| 0.7465277777777778 | 0 |
| 0.7472222222222222 | 0 |
| 0.7479166666666667 | 0 |
| 0.748611111111111 | 0 |
| 0.7493055555555556 | 0 |
| 0.75 | 0 |
| 0.7506944444444444 | 0 |
| 0.751388888888889 | 0 |
| 0.7520833333333333 | 0 |
| 0.7527777777777778 | 0 |
| 0.7534722222222222 | 0 |
| 0.7541666666666668 | 0 |
| 0.7548611111111111 | 0 |
| 0.7555555555555555 | 0 |
| 0.75625 | 0 |
| 0.7569444444444445 | 0 |
| 0.7576388888888889 | 0 |
| 0.7583333333333333 | 0 |
| 0.7590277777777777 | 0 |
| 0.7597222222222223 | 0 |
| 0.7604166666666666 | 0 |
| 0.7611111111111111 | 0 |
| 0.7618055555555556 | 0 |
| 0.7625000000000001 | 0 |
| 0.7631944444444444 | 0 |
| 0.7638888888888888 | 0 |
| 0.7645833333333334 | 0 |
| 0.7652777777777778 | 0 |
| 0.7659722222222222 | 0 |
| 0.7666666666666666 | 0 |
| 0.7673611111111112 | 0 |
| 0.7680555555555556 | 0 |
| 0.7687499999999999 | 0 |
| 0.7694444444444444 | 0 |
| 0.7701388888888889 | 0 |
| 0.7708333333333334 | 0 |
| 0.7715277777777777 | 0 |
| 0.7722222222222223 | 0 |
| 0.7729166666666667 | 0 |
| 0.7736111111111111 | 0 |
| 0.7743055555555555 | 0 |
| 0.775 | 0 |
| 0.7756944444444445 | 0 |
| 0.7763888888888889 | 0 |
| 0.7770833333333332 | 0 |
| 0.7777777777777778 | 0 |
| 0.7784722222222222 | 0 |
| 0.7791666666666667 | 0 |
| 0.779861111111111 | 0 |
| 0.7805555555555556 | 0 |
| 0.78125 | 0 |
| 0.7819444444444444 | 0 |
| 0.782638888888889 | 0 |
| 0.7833333333333333 | 0 |
| 0.7840277777777778 | 0 |
| 0.7847222222222222 | 0 |
| 0.7854166666666668 | 0 |
| 0.7861111111111111 | 0 |
| 0.7868055555555555 | 0 |
| 0.7875 | 0 |
| 0.7881944444444445 | 0 |
| 0.7888888888888889 | 0 |
| 0.7895833333333333 | 0 |
| 0.7902777777777777 | 0 |
| 0.7909722222222223 | 0 |
| 0.7916666666666666 | 0 |
| 0.7923611111111111 | 0 |
| 0.7930555555555556 | 0 |
| 0.7937500000000001 | 0 |
| 0.7944444444444444 | 0 |
| 0.7951388888888888 | 0 |
| 0.7958333333333334 | 0 |
| 0.7965277777777778 | 0 |
| 0.7972222222222222 | 0 |
| 0.7979166666666666 | 0 |
| 0.7986111111111112 | 0 |
| 0.7993055555555556 | 0 |
| 0.7999999999999999 | 0 |
| 0.8006944444444444 | 0 |
| 0.8013888888888889 | 0 |
| 0.8020833333333334 | 0 |
| 0.8027777777777777 | 0 |
| 0.8034722222222223 | 0 |
| 0.8041666666666667 | 0 |
| 0.8048611111111111 | 0 |
| 0.8055555555555555 | 0 |
| 0.80625 | 0 |
| 0.8069444444444445 | 0 |
| 0.8076388888888889 | 0 |
| 0.8083333333333332 | 0 |
| 0.8090277777777778 | 0 |
| 0.8097222222222222 | 0 |
| 0.8104166666666667 | 0 |
| 0.811111111111111 | 0 |
| 0.8118055555555556 | 0 |
| 0.8125 | 0 |
| 0.8131944444444444 | 0 |
| 0.813888888888889 | 0 |
| 0.8145833333333333 | 0 |
| 0.8152777777777778 | 0 |
| 0.8159722222222222 | 0 |
| 0.8166666666666668 | 0 |
| 0.8173611111111111 | 0 |
| 0.8180555555555555 | 0 |
| 0.81875 | 0 |
| 0.8194444444444445 | 0 |
| 0.8201388888888889 | 0 |
| 0.8208333333333333 | 0 |
| 0.8215277777777777 | 0 |
| 0.8222222222222223 | 0 |
| 0.8229166666666666 | 0 |
| 0.8236111111111111 | 0 |
| 0.8243055555555556 | 0 |
| 0.8250000000000001 | 0 |
| 0.8256944444444444 | 0 |
| 0.8263888888888888 | 0 |
| 0.8270833333333334 | 0 |
| 0.8277777777777778 | 0 |
| 0.8284722222222222 | 0 |
| 0.8291666666666666 | 0 |
| 0.8298611111111112 | 0 |
| 0.8305555555555556 | 0 |
| 0.8312499999999999 | 0 |
| 0.8319444444444444 | 0 |
| 0.8326388888888889 | 0 |
| 0.8333333333333334 | 0 |
| 0.8340277777777777 | 0 |
| 0.8347222222222223 | 0 |
| 0.8354166666666667 | 0 |
| 0.8361111111111111 | 0 |
| 0.8368055555555555 | 0 |
| 0.8375 | 0 |
| 0.8381944444444445 | 0 |
| 0.8388888888888889 | 0 |
| 0.8395833333333332 | 0 |
| 0.8402777777777778 | 0 |
| 0.8409722222222222 | 0 |
| 0.8416666666666667 | 0 |
| 0.842361111111111 | 0 |
| 0.8430555555555556 | 0 |
| 0.84375 | 0 |
| 0.8444444444444444 | 0 |
| 0.845138888888889 | 0 |
| 0.8458333333333333 | 0 |
| 0.8465277777777778 | 0 |
| 0.8472222222222222 | 0 |
| 0.8479166666666668 | 0 |
| 0.8486111111111111 | 0 |
| 0.8493055555555555 | 0 |
| 0.85 | 0 |
| 0.8506944444444445 | 0 |
| 0.8513888888888889 | 0 |
| 0.8520833333333333 | 0 |
| 0.8527777777777777 | 0 |
| 0.8534722222222223 | 0 |
| 0.8541666666666666 | 0 |
| 0.8548611111111111 | 0 |
| 0.8555555555555556 | 0 |
| 0.8562500000000001 | 0 |
| 0.8569444444444444 | 0 |
| 0.8576388888888888 | 0 |
| 0.8583333333333334 | 0 |
| 0.8590277777777778 | 0 |
| 0.8597222222222222 | 0 |
| 0.8604166666666666 | 0 |
| 0.8611111111111112 | 0 |
| 0.8618055555555556 | 0 |
| 0.8624999999999999 | 0 |
| 0.8631944444444444 | 0 |
| 0.8638888888888889 | 0 |
| 0.8645833333333334 | 0 |
| 0.8652777777777777 | 0 |
| 0.8659722222222223 | 0 |
| 0.8666666666666667 | 0 |
| 0.8673611111111111 | 0 |
| 0.8680555555555555 | 0 |
| 0.86875 | 0 |
| 0.8694444444444445 | 0 |
| 0.8701388888888889 | 0 |
| 0.8708333333333332 | 0 |
| 0.8715277777777778 | 0 |
| 0.8722222222222222 | 0 |
| 0.8729166666666667 | 0 |
| 0.873611111111111 | 0 |
| 0.8743055555555556 | 0 |
| 0.875 | 0 |
| 0.8756944444444444 | 0 |
| 0.876388888888889 | 0 |
| 0.8770833333333333 | 0 |
| 0.8777777777777778 | 0 |
| 0.8784722222222222 | 0 |
| 0.8791666666666668 | 0 |
| 0.8798611111111111 | 0 |
| 0.8805555555555555 | 0 |
| 0.88125 | 0 |
| 0.8819444444444445 | 0 |
| 0.8826388888888889 | 0 |
| 0.8833333333333333 | 0 |
| 0.8840277777777777 | 0 |
| 0.8847222222222223 | 0 |
| 0.8854166666666666 | 0 |
| 0.8861111111111111 | 0 |
| 0.8868055555555556 | 0 |
| 0.8875000000000001 | 0 |
| 0.8881944444444444 | 0 |
| 0.8888888888888888 | 0 |
| 0.8895833333333334 | 0 |
| 0.8902777777777778 | 0 |
| 0.8909722222222222 | 0 |
| 0.8916666666666666 | 0 |
| 0.8923611111111112 | 0 |
| 0.8930555555555556 | 0 |
| 0.8937499999999999 | 0 |
| 0.8944444444444444 | 0 |
| 0.8951388888888889 | 0 |
| 0.8958333333333334 | 0 |
| 0.8965277777777777 | 0 |
| 0.8972222222222223 | 0 |
| 0.8979166666666667 | 0 |
| 0.8986111111111111 | 0 |
| 0.8993055555555555 | 0 |
| 0.9 | 0 |
| 0.9006944444444445 | 0 |
| 0.9013888888888889 | 0 |
| 0.9020833333333332 | 0 |
| 0.9027777777777778 | 0 |
| 0.9034722222222222 | 0 |
| 0.9041666666666667 | 0 |
| 0.904861111111111 | 0 |
| 0.9055555555555556 | 0 |
| 0.90625 | 0 |
| 0.9069444444444444 | 0 |
| 0.907638888888889 | 0 |
| 0.9083333333333333 | 0 |
| 0.9090277777777778 | 0 |
| 0.9097222222222222 | 0 |
| 0.9104166666666668 | 0 |
| 0.9111111111111111 | 0 |
| 0.9118055555555555 | 0 |
| 0.9125 | 0 |
| 0.9131944444444445 | 0 |
| 0.9138888888888889 | 0 |
| 0.9145833333333333 | 0 |
| 0.9152777777777777 | 0 |
| 0.9159722222222223 | 0 |
| 0.9166666666666666 | 0 |
| 0.9173611111111111 | 0 |
| 0.9180555555555556 | 0 |
| 0.9187500000000001 | 0 |
| 0.9194444444444444 | 0 |
| 0.9201388888888888 | 0 |
| 0.9208333333333334 | 0 |
| 0.9215277777777778 | 0 |
| 0.9222222222222222 | 0 |
| 0.9229166666666666 | 0 |
| 0.9236111111111112 | 0 |
| 0.9243055555555556 | 0 |
| 0.9249999999999999 | 0 |
| 0.9256944444444444 | 0 |
| 0.9263888888888889 | 0 |
| 0.9270833333333334 | 0 |
| 0.9277777777777777 | 0 |
| 0.9284722222222223 | 0 |
| 0.9291666666666667 | 0 |
| 0.9298611111111111 | 0 |
| 0.9305555555555555 | 0 |
| 0.93125 | 0 |
| 0.9319444444444445 | 0 |
| 0.9326388888888889 | 0 |
| 0.9333333333333332 | 0 |
| 0.9340277777777778 | 0 |
| 0.9347222222222222 | 0 |
| 0.9354166666666667 | 0 |
| 0.936111111111111 | 0 |
| 0.9368055555555556 | 0 |
| 0.9375 | 0 |
| 0.9381944444444444 | 0 |
| 0.938888888888889 | 0 |
| 0.9395833333333333 | 0 |
| 0.9402777777777778 | 0 |
| 0.9409722222222222 | 0 |
| 0.9416666666666668 | 0 |
| 0.9423611111111111 | 0 |
| 0.9430555555555555 | 0 |
| 0.94375 | 0 |
| 0.9444444444444445 | 0 |
| 0.9451388888888889 | 0 |
| 0.9458333333333333 | 0 |
| 0.9465277777777777 | 0 |
| 0.9472222222222223 | 0 |
| 0.9479166666666666 | 0 |
| 0.9486111111111111 | 0 |
| 0.9493055555555556 | 0 |
| 0.9500000000000001 | 0 |
| 0.9506944444444444 | 0 |
| 0.9513888888888888 | 0 |
| 0.9520833333333334 | 0 |
| 0.9527777777777778 | 0 |
| 0.9534722222222222 | 0 |
| 0.9541666666666666 | 0 |
| 0.9548611111111112 | 0 |
| 0.9555555555555556 | 0 |
| 0.9562499999999999 | 0 |
| 0.9569444444444444 | 0 |
| 0.9576388888888889 | 0 |
| 0.9583333333333334 | 0 |
| 0.9590277777777777 | 0 |
| 0.9597222222222223 | 0 |
| 0.9604166666666667 | 0 |
| 0.9611111111111111 | 0 |
| 0.9618055555555555 | 0 |
| 0.9625 | 0 |
| 0.9631944444444445 | 0 |
| 0.9638888888888889 | 0 |
| 0.9645833333333332 | 0 |
| 0.9652777777777778 | 0 |
| 0.9659722222222222 | 0 |
| 0.9666666666666667 | 0 |
| 0.967361111111111 | 0 |
| 0.9680555555555556 | 0 |
| 0.96875 | 0 |
| 0.9694444444444444 | 0 |
| 0.970138888888889 | 0 |
| 0.9708333333333333 | 0 |
| 0.9715277777777778 | 0 |
| 0.9722222222222222 | 0 |
| 0.9729166666666668 | 0 |
| 0.9736111111111111 | 0 |
| 0.9743055555555555 | 0 |
| 0.975 | 0 |
| 0.9756944444444445 | 0 |
| 0.9763888888888889 | 0 |
| 0.9770833333333333 | 0 |
| 0.9777777777777777 | 0 |
| 0.9784722222222223 | 0 |
| 0.9791666666666666 | 0 |
| 0.9798611111111111 | 0 |
| 0.9805555555555556 | 0 |
| 0.9812500000000001 | 0 |
| 0.9819444444444444 | 0 |
| 0.9826388888888888 | 0 |
| 0.9833333333333334 | 0 |
| 0.9840277777777778 | 0 |
| 0.9847222222222222 | 0 |
| 0.9854166666666666 | 0 |
| 0.9861111111111112 | 0 |
| 0.9868055555555556 | 0 |
| 0.9874999999999999 | 0 |
| 0.9881944444444444 | 0 |
| 0.9888888888888889 | 0 |
| 0.9895833333333334 | 0 |
| 0.9902777777777777 | 0 |
| 0.9909722222222223 | 0 |
| 0.9916666666666667 | 0 |
| 0.9923611111111111 | 0 |
| 0.9930555555555555 | 0 |
| 0.99375 | 0 |
| 0.9944444444444445 | 0 |
| 0.9951388888888889 | 0 |
| 0.9958333333333332 | 0 |
| 0.9965277777777778 | 0 |
| 0.9972222222222222 | 0 |
| 0.9979166666666667 | 0 |
| 0.998611111111111 | 0 |
| 0.9993055555555556 | 0 |